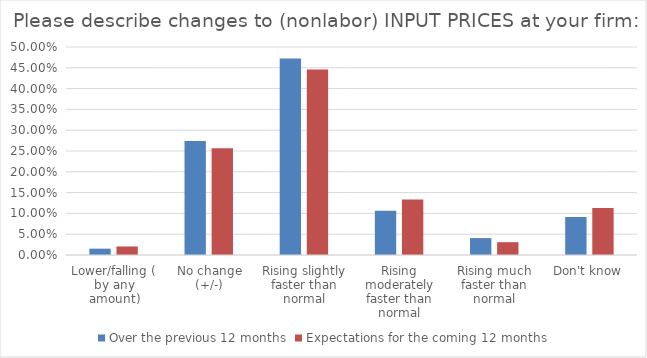
| Category | Over the previous 12 months | Expectations for the coming 12 months |
|---|---|---|
| Lower/falling (by any amount) | 0.015 | 0.02 |
| No change (+/-) | 0.274 | 0.256 |
| Rising slightly faster than normal | 0.472 | 0.446 |
| Rising moderately faster than normal | 0.107 | 0.133 |
| Rising much faster than normal | 0.041 | 0.031 |
| Don't know | 0.091 | 0.113 |